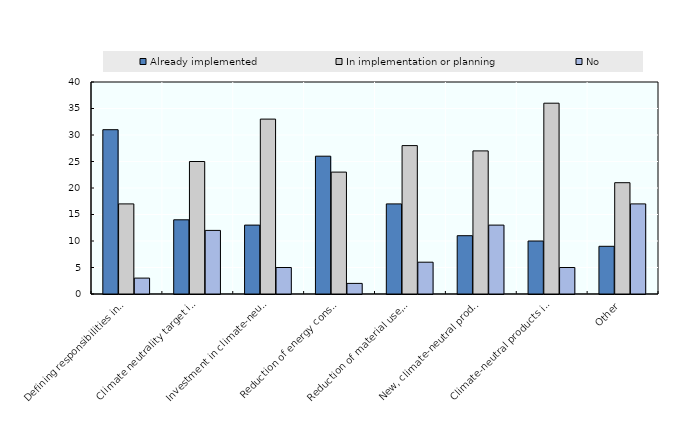
| Category | Already implemented | In implementation or planning | No |
|---|---|---|---|
| Defining responsibilities in management | 31 | 17 | 3 |
| Climate neutrality target in HR planning | 14 | 25 | 12 |
| Investment in climate-neutral technologies | 13 | 33 | 5 |
| Reduction of energy consumption | 26 | 23 | 2 |
| Reduction of material use, circular economy | 17 | 28 | 6 |
| New, climate-neutral products in sales | 11 | 27 | 13 |
| Climate-neutral products in purchasing | 10 | 36 | 5 |
| Other | 9 | 21 | 17 |